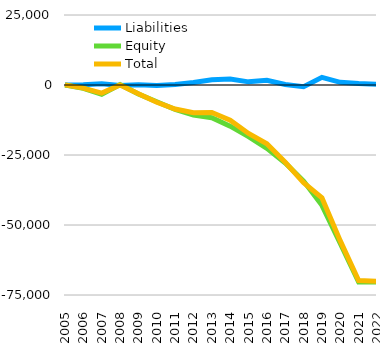
| Category | Liabilities  | Equity  | Total |
|---|---|---|---|
| 2005 | 31.4 | 0.913 | 32.313 |
| 2006 | 52.475 | -1179.725 | -1127.25 |
| 2007 | 435.275 | -3320.698 | -2885.423 |
| 2008 | -200.395 | 173.967 | -26.428 |
| 2009 | 81.613 | -3237.138 | -3155.525 |
| 2010 | -199.999 | -5978.228 | -6178.227 |
| 2011 | 154.346 | -8743.683 | -8589.337 |
| 2012 | 881.393 | -10771.604 | -9890.211 |
| 2013 | 1865.297 | -11671.557 | -9806.26 |
| 2014 | 2143.854 | -14692.422 | -12548.568 |
| 2015 | 1123.314 | -18426.037 | -17302.723 |
| 2016 | 1679.725 | -22644.507 | -20964.782 |
| 2017 | 210.103 | -27830.583 | -27620.48 |
| 2018 | -618.477 | -34299.652 | -34918.129 |
| 2019 | 2730.896 | -42983.921 | -40253.025 |
| 2020 | 947.238 | -56617.921 | -55670.683 |
| 2021 | 504.238 | -70350.921 | -69846.683 |
| 2022 | 259.238 | -70350.921 | -70091.683 |